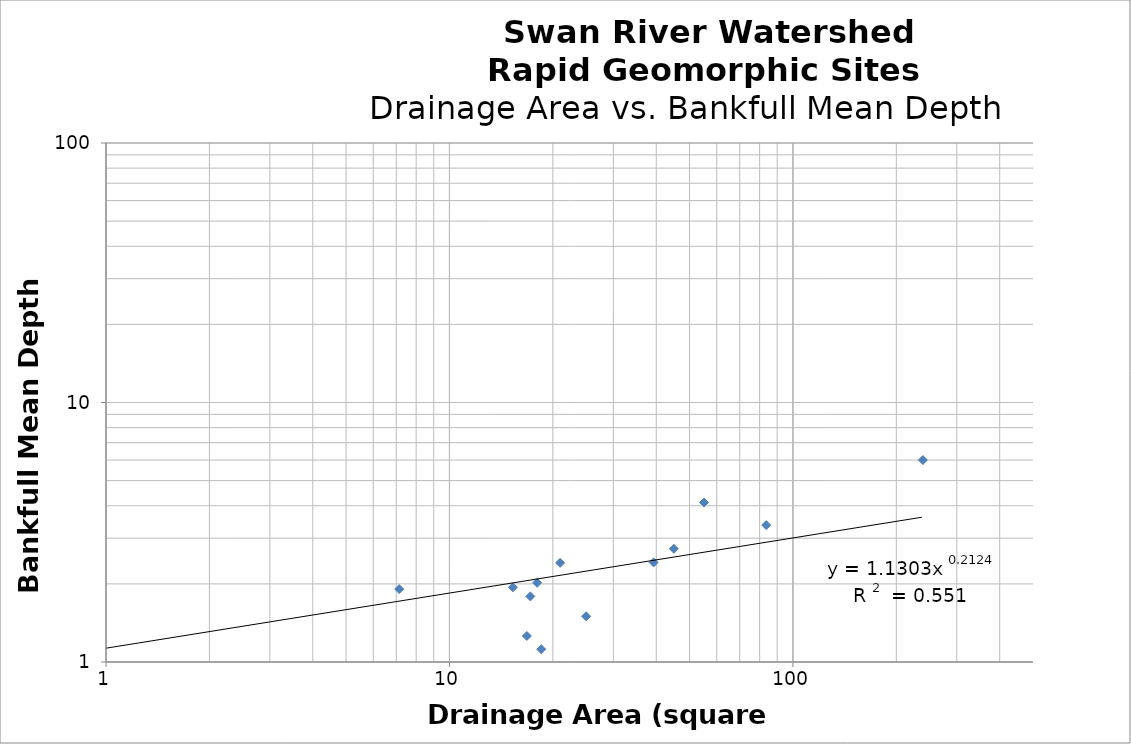
| Category | Bkf_D |
|---|---|
| 7.14 | 1.91 |
| 15.3 | 1.94 |
| 16.8 | 1.26 |
| 17.2 | 1.79 |
| 18.0 | 2.02 |
| 0.1 | 1 |
| 18.5 | 1.12 |
| 21.0 | 2.41 |
| 25.0 | 1.5 |
| 39.3 | 2.42 |
| 45.0 | 2.73 |
| 55.1 | 4.12 |
| 83.6 | 3.37 |
| 239.0 | 6 |